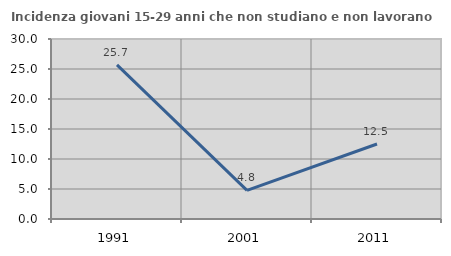
| Category | Incidenza giovani 15-29 anni che non studiano e non lavorano  |
|---|---|
| 1991.0 | 25.685 |
| 2001.0 | 4.762 |
| 2011.0 | 12.5 |